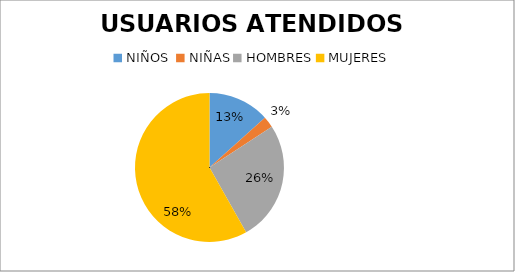
| Category | USUARIOS ATENDIDOS  PORCENTAJE | USUARIOS ATENDIDOS  CANTIDAD |
|---|---|---|
| NIÑOS  | 13.333 | 22 |
| NIÑAS | 2.424 | 4 |
| HOMBRES | 26.061 | 43 |
| MUJERES | 58.182 | 96 |